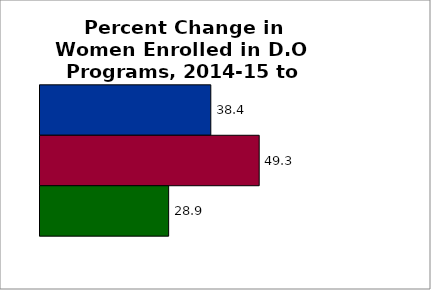
| Category | 50 states and D.C. | SREB states | State |
|---|---|---|---|
| 0 | 38.384 | 49.257 | 28.911 |